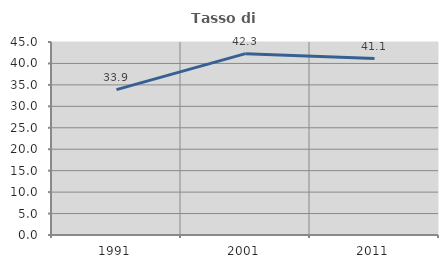
| Category | Tasso di occupazione   |
|---|---|
| 1991.0 | 33.905 |
| 2001.0 | 42.283 |
| 2011.0 | 41.146 |